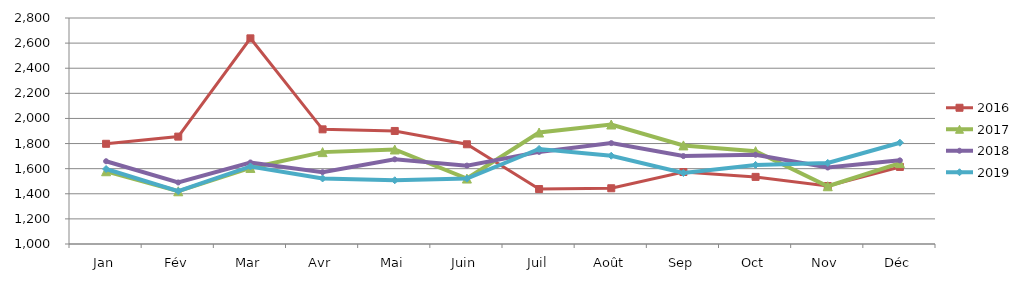
| Category | 2015 | 2016 | 2017 | 2018 | 2019 |
|---|---|---|---|---|---|
| Jan |  | 1798.146 | 1579.519 | 1659.233 | 1597.182 |
| Fév |  | 1855.266 | 1419.892 | 1490.116 | 1420.981 |
| Mar |  | 2637.962 | 1605.876 | 1649.429 | 1617.601 |
| Avr |  | 1913.237 | 1731.762 | 1571.732 | 1521.999 |
| Mai |  | 1900.309 | 1752.669 | 1674.727 | 1507.654 |
| Juin |  | 1794.333 | 1521.303 | 1624.201 | 1521.033 |
| Juil |  | 1437.75 | 1887.908 | 1733.621 | 1757.049 |
| Août |  | 1443.965 | 1951.735 | 1803.444 | 1702.894 |
| Sep |  | 1573.366 | 1785.145 | 1700.265 | 1565.361 |
| Oct |  | 1534.523 | 1739.554 | 1710.862 | 1629.894 |
| Nov |  | 1461.686 | 1460 | 1609.178 | 1645.62 |
| Déc |  | 1613.843 | 1644.49 | 1666.129 | 1806.739 |